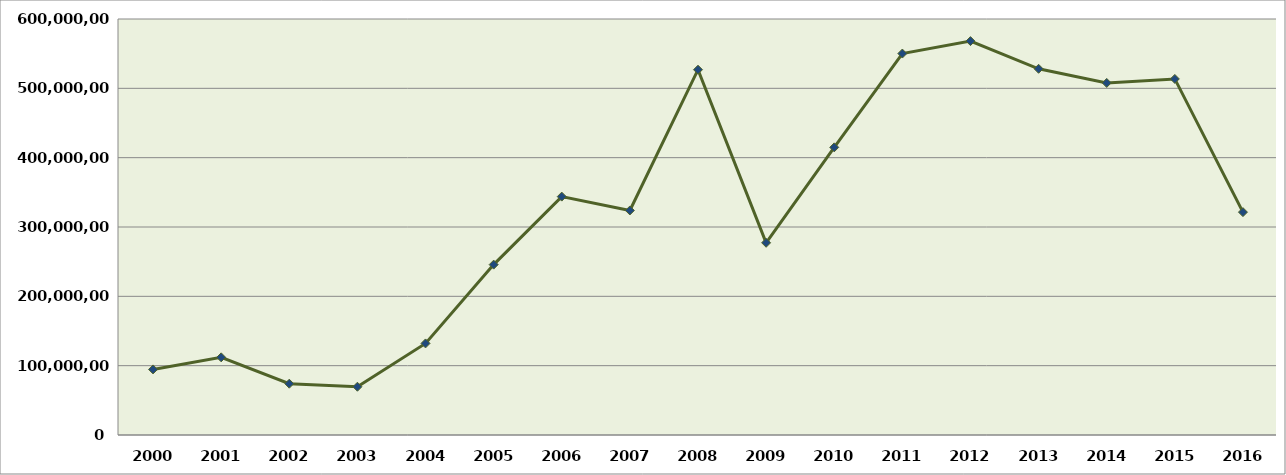
| Category | Valores em US$/FOB |
|---|---|
| 2000.0 | 94596367 |
| 2001.0 | 112025635 |
| 2002.0 | 73980371 |
| 2003.0 | 69607616 |
| 2004.0 | 132061869 |
| 2005.0 | 245726571 |
| 2006.0 | 343824663 |
| 2007.0 | 323850748 |
| 2008.0 | 526848434 |
| 2009.0 | 277230116 |
| 2010.0 | 414871651 |
| 2011.0 | 550169353 |
| 2012.0 | 568126174 |
| 2013.0 | 528172441 |
| 2014.0 | 507778160 |
| 2015.0 | 513556571 |
| 2016.0 | 321439147 |